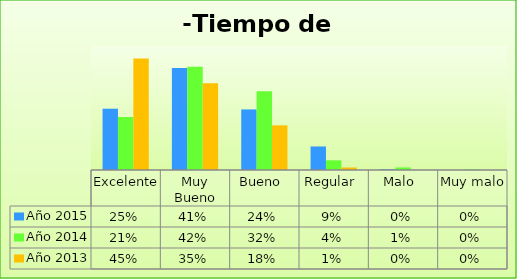
| Category | Año 2015 | Año 2014 | Año 2013 |
|---|---|---|---|
| Excelente | 0.247 | 0.214 | 0.45 |
| Muy Bueno | 0.411 | 0.417 | 0.35 |
| Bueno  | 0.244 | 0.318 | 0.18 |
| Regular  | 0.095 | 0.039 | 0.01 |
| Malo  | 0.003 | 0.01 | 0 |
| Muy malo  | 0 | 0.003 | 0 |